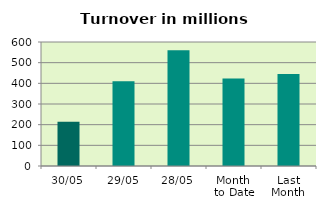
| Category | Series 0 |
|---|---|
| 30/05 | 214.474 |
| 29/05 | 410.675 |
| 28/05 | 560.188 |
| Month 
to Date | 423.293 |
| Last
Month | 444.663 |